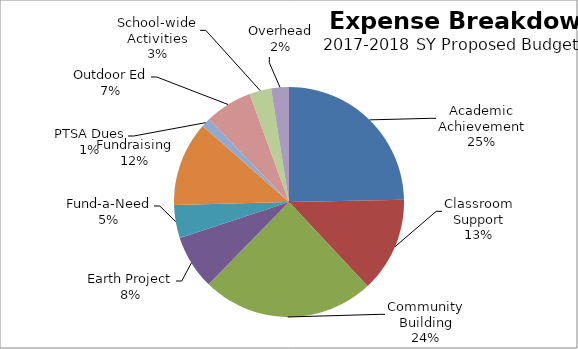
| Category | Series 0 |
|---|---|
| Academic Achievement | 48000 |
| Classroom Support | 26000 |
| Community Building | 47195 |
| Earth Project | 14850 |
| Fund-a-Need | 9000 |
| Fundraising | 23150 |
| PTSA Dues | 2500 |
| Outdoor Ed | 13000 |
| School-wide Activities | 5950 |
| Overhead | 4850 |